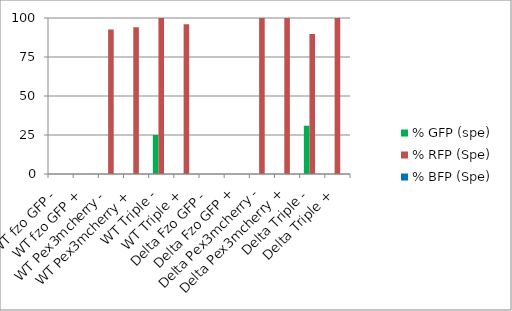
| Category | % GFP (spe) | % RFP (Spe) | % BFP (Spe) |
|---|---|---|---|
| WT fzo GFP - | 0 | 0 | 0 |
| WT fzo GFP + | 0 | 0 | 0 |
| WT Pex3mcherry - | 0 | 92.632 | 0 |
| WT Pex3mcherry + | 0 | 94.118 | 0 |
| WT Triple - | 25 | 100 | 0 |
| WT Triple + | 0 | 96.04 | 0 |
| Delta Fzo GFP - | 0 | 0 | 0 |
| Delta Fzo GFP + | 0 | 0 | 0 |
| Delta Pex3mcherry - | 0 | 100 | 0 |
| Delta Pex3mcherry + | 0 | 100 | 0 |
| Delta Triple - | 30.952 | 89.72 | 0 |
| Delta Triple + | 0 | 100 | 0 |